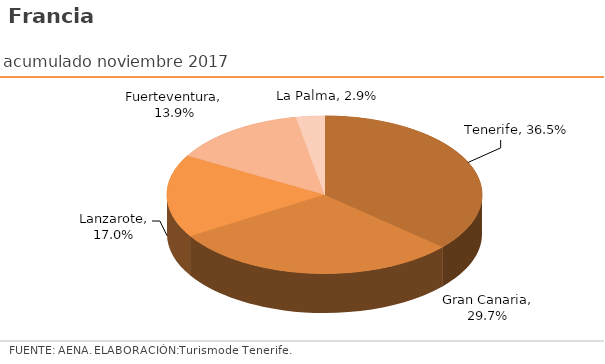
| Category | acumulado noviembre 2017 |
|---|---|
| Tenerife | 0.365 |
| Gran Canaria | 0.297 |
| Lanzarote | 0.17 |
| Fuerteventura | 0.139 |
| La Palma | 0.029 |